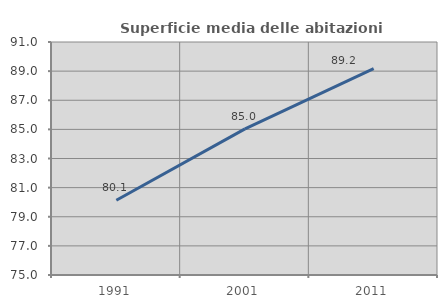
| Category | Superficie media delle abitazioni occupate |
|---|---|
| 1991.0 | 80.134 |
| 2001.0 | 85.038 |
| 2011.0 | 89.175 |